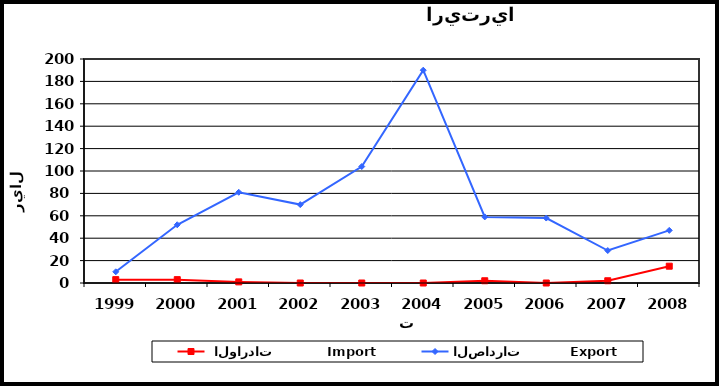
| Category |  الواردات           Import | الصادرات          Export |
|---|---|---|
| 1999.0 | 3 | 10 |
| 2000.0 | 3 | 52 |
| 2001.0 | 1 | 81 |
| 2002.0 | 0 | 70 |
| 2003.0 | 0 | 104 |
| 2004.0 | 0 | 190 |
| 2005.0 | 2 | 59 |
| 2006.0 | 0 | 58 |
| 2007.0 | 2 | 29 |
| 2008.0 | 15 | 47 |